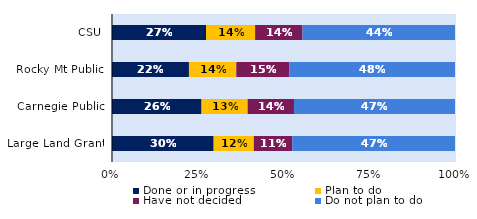
| Category | Done or in progress | Plan to do | Have not decided | Do not plan to do |
|---|---|---|---|---|
| CSU | 0.274 | 0.143 | 0.138 | 0.445 |
| Rocky Mt Public | 0.224 | 0.138 | 0.155 | 0.483 |
| Carnegie Public | 0.261 | 0.134 | 0.135 | 0.469 |
| Large Land Grant | 0.296 | 0.117 | 0.112 | 0.474 |